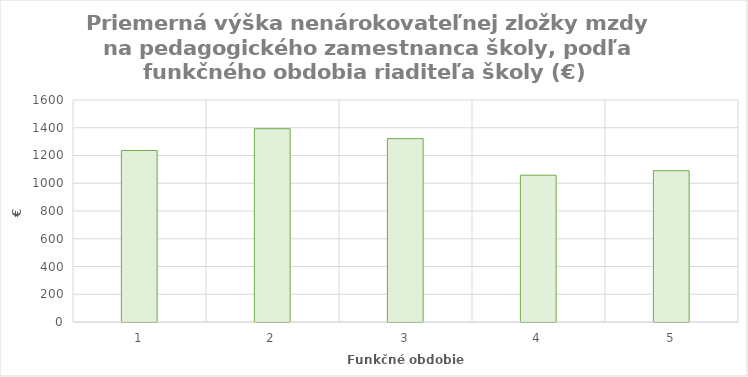
| Category | Series 1 |
|---|---|
| 0 | 1236.109 |
| 1 | 1393.212 |
| 2 | 1321.617 |
| 3 | 1057.789 |
| 4 | 1090.67 |